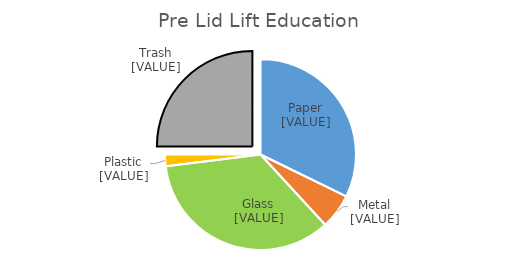
| Category | Series 0 |
|---|---|
| Paper | 0.322 |
| Metals | 0.059 |
| Glass | 0.349 |
| Plastic | 0.02 |
| Trash  | 0.25 |